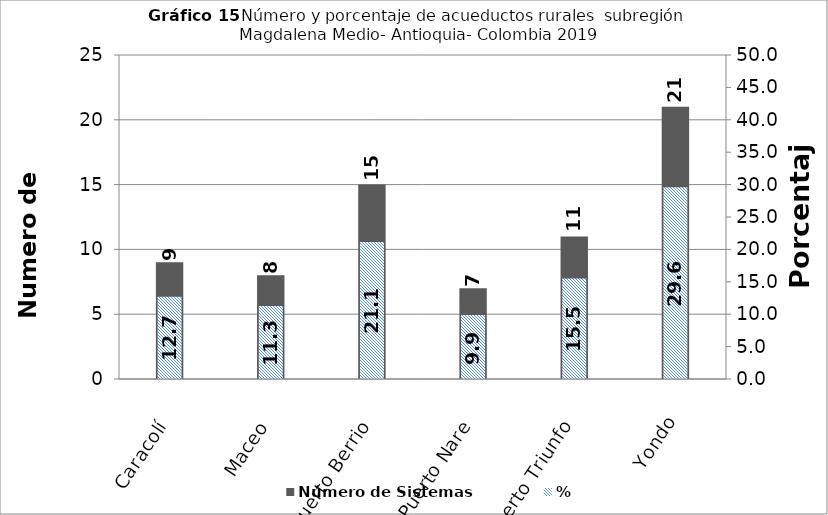
| Category | Número de Sistemas |
|---|---|
| Caracolí | 9 |
| Maceo | 8 |
| Puerto Berrio | 15 |
| Puerto Nare | 7 |
| Puerto Triunfo | 11 |
| Yondo | 21 |